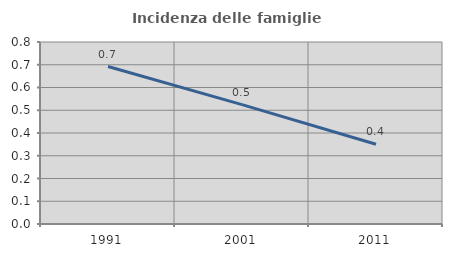
| Category | Incidenza delle famiglie numerose |
|---|---|
| 1991.0 | 0.692 |
| 2001.0 | 0.525 |
| 2011.0 | 0.351 |